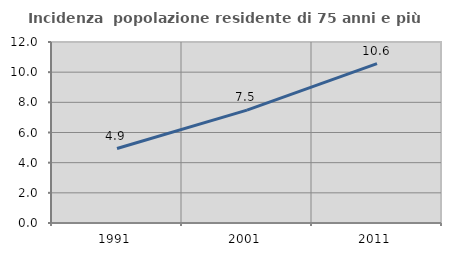
| Category | Incidenza  popolazione residente di 75 anni e più |
|---|---|
| 1991.0 | 4.937 |
| 2001.0 | 7.482 |
| 2011.0 | 10.57 |